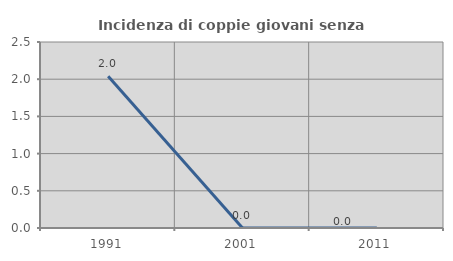
| Category | Incidenza di coppie giovani senza figli |
|---|---|
| 1991.0 | 2.041 |
| 2001.0 | 0 |
| 2011.0 | 0 |